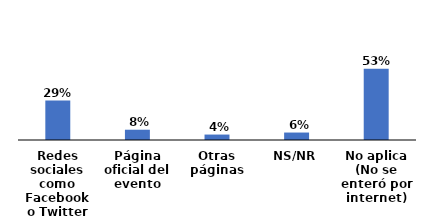
| Category | Series 0 |
|---|---|
| Redes sociales como Facebook o Twitter | 0.295 |
| Página oficial del evento | 0.077 |
| Otras páginas | 0.041 |
| NS/NR | 0.056 |
| No aplica (No se enteró por internet) | 0.532 |